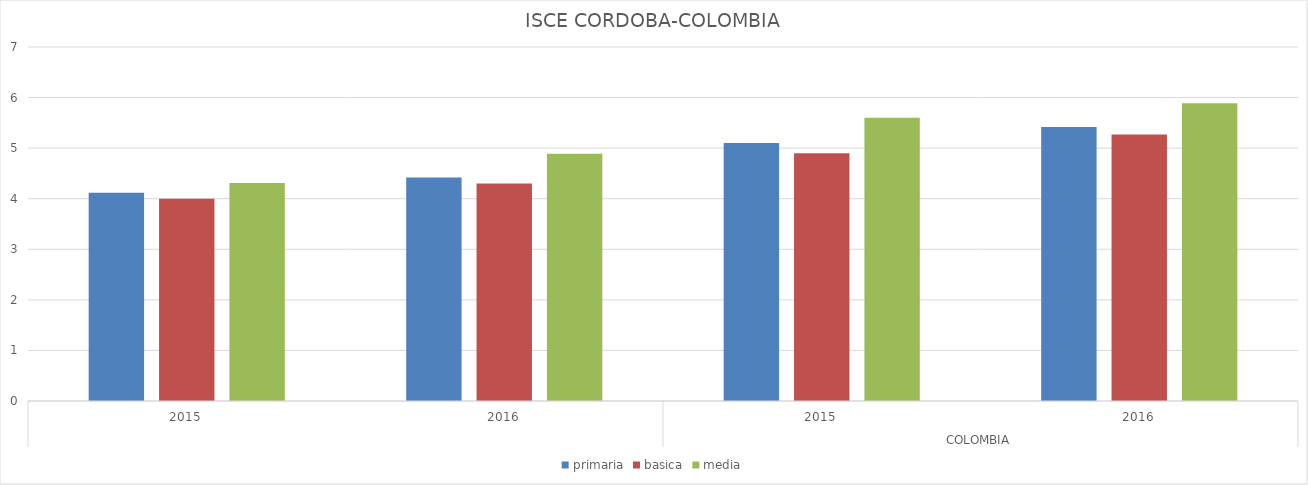
| Category | primaria | basica | media |
|---|---|---|---|
| 0 | 4.12 | 4 | 4.31 |
| 1 | 4.42 | 4.3 | 4.89 |
| 2 | 5.1 | 4.9 | 5.6 |
| 3 | 5.42 | 5.27 | 5.89 |